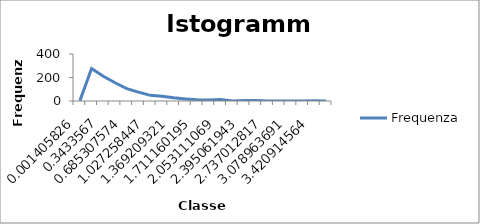
| Category | Frequenza |
|---|---|
| 0,001405826 | 1 |
| 0,172381263 | 277 |
| 0,3433567 | 211 |
| 0,514332137 | 155 |
| 0,685307574 | 105 |
| 0,856283011 | 76 |
| 1,027258447 | 48 |
| 1,198233884 | 40 |
| 1,369209321 | 27 |
| 1,540184758 | 18 |
| 1,711160195 | 11 |
| 1,882135632 | 8 |
| 2,053111069 | 12 |
| 2,224086506 | 1 |
| 2,395061943 | 4 |
| 2,56603738 | 4 |
| 2,737012817 | 0 |
| 2,907988254 | 0 |
| 3,078963691 | 0 |
| 3,249939128 | 0 |
| 3,420914564 | 2 |
| Altro | 0 |